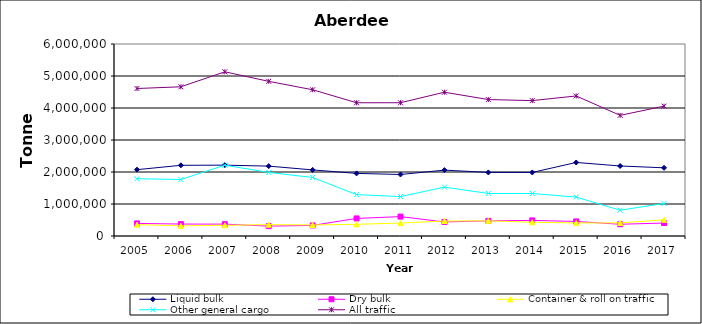
| Category | Liquid bulk | Dry bulk | Container & roll on traffic | Other general cargo | All traffic |
|---|---|---|---|---|---|
| 2005.0 | 2073000 | 394000 | 354000 | 1790000 | 4609000 |
| 2006.0 | 2209000 | 373000 | 317000 | 1765000 | 4663000 |
| 2007.0 | 2214000 | 371000 | 334000 | 2213000 | 5131000 |
| 2008.0 | 2184000 | 308000 | 355000 | 1986000 | 4833000 |
| 2009.0 | 2065366 | 330706 | 345168 | 1828821 | 4570061 |
| 2010.0 | 1957000 | 549000 | 365000 | 1293000 | 4164000 |
| 2011.0 | 1922000 | 606000 | 405000 | 1231000 | 4165000 |
| 2012.0 | 2059000 | 439000 | 468000 | 1527000 | 4493000 |
| 2013.0 | 1987000 | 474000 | 474000 | 1329000 | 4264000 |
| 2014.0 | 1986000 | 487000 | 430000 | 1328000 | 4231000 |
| 2015.0 | 2298000 | 455000 | 408000 | 1215000 | 4376000 |
| 2016.0 | 2188000 | 367000 | 409000 | 806000 | 3770000 |
| 2017.0 | 2131000 | 405000 | 505000 | 1018000 | 4058000 |